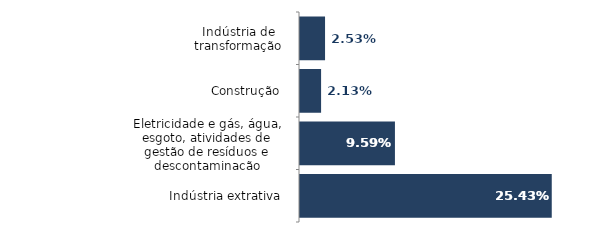
| Category | Series 0 |
|---|---|
| Indústria de transformação | 0.025 |
| Construção | 0.021 |
| Eletricidade e gás, água, esgoto, atividades de gestão de resíduos e descontaminação | 0.096 |
| Indústria extrativa | 0.254 |